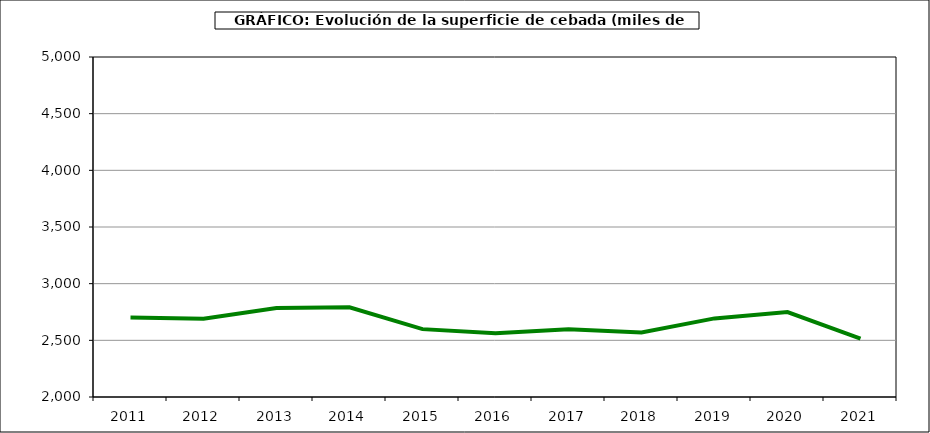
| Category | Superficie |
|---|---|
| 2011.0 | 2700.679 |
| 2012.0 | 2691.086 |
| 2013.0 | 2784.281 |
| 2014.0 | 2792.226 |
| 2015.0 | 2598.896 |
| 2016.0 | 2563.195 |
| 2017.0 | 2597.527 |
| 2018.0 | 2569.462 |
| 2019.0 | 2693.508 |
| 2020.0 | 2749.039 |
| 2021.0 | 2514.561 |